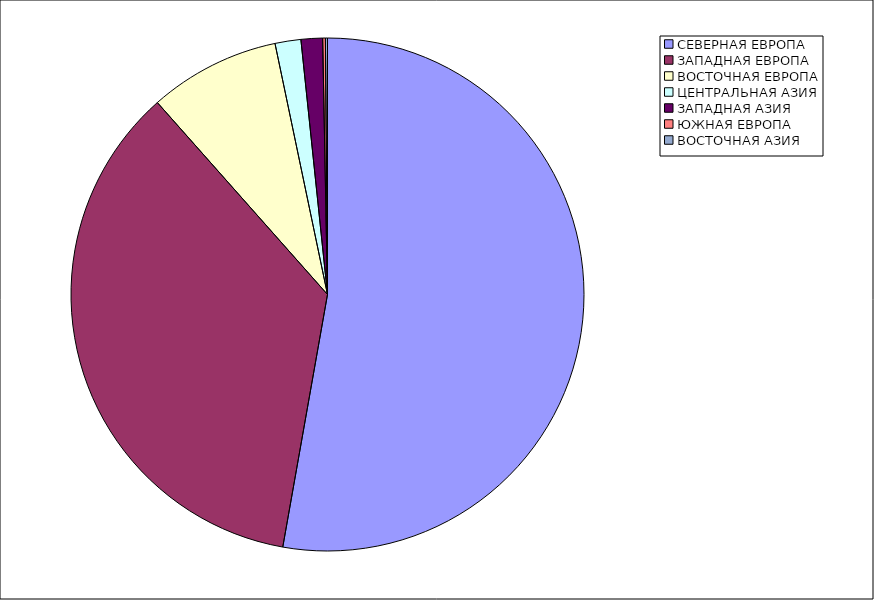
| Category | Оборот |
|---|---|
| СЕВЕРНАЯ ЕВРОПА | 52.791 |
| ЗАПАДНАЯ ЕВРОПА | 35.666 |
| ВОСТОЧНАЯ ЕВРОПА | 8.261 |
| ЦЕНТРАЛЬНАЯ АЗИЯ | 1.627 |
| ЗАПАДНАЯ АЗИЯ | 1.354 |
| ЮЖНАЯ ЕВРОПА | 0.172 |
| ВОСТОЧНАЯ АЗИЯ | 0.129 |